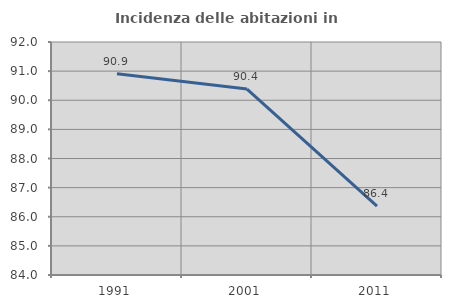
| Category | Incidenza delle abitazioni in proprietà  |
|---|---|
| 1991.0 | 90.909 |
| 2001.0 | 90.385 |
| 2011.0 | 86.364 |